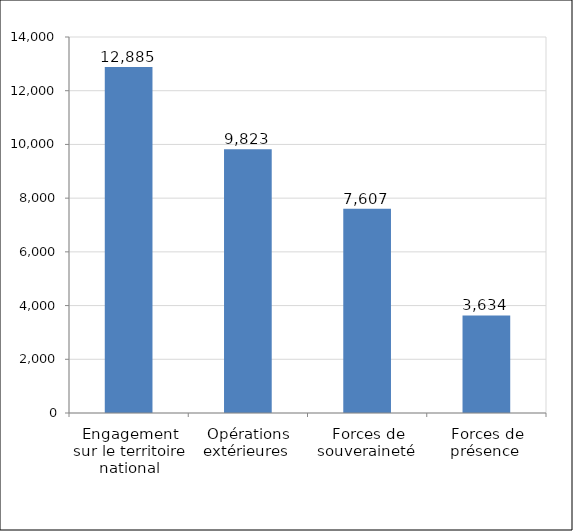
| Category | Effectif  |
|---|---|
| Engagement sur le territoire national | 12885 |
| Opérations extérieures  | 9823 |
| Forces de souveraineté  | 7607 |
| Forces de présence  | 3634 |